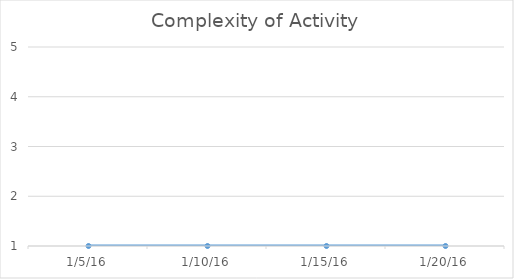
| Category | Series 0 |
|---|---|
| 1/5/16 | 1 |
| 1/10/16 | 1 |
| 1/15/16 | 1 |
| 1/20/16 | 1 |